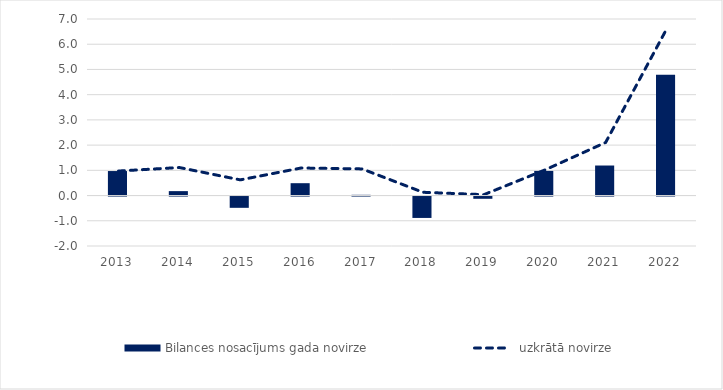
| Category | Bilances nosacījums |
|---|---|
| 2013.0 | 0.972 |
| 2014.0 | 0.176 |
| 2015.0 | -0.447 |
| 2016.0 | 0.49 |
| 2017.0 | 0.029 |
| 2018.0 | -0.848 |
| 2019.0 | -0.089 |
| 2020.0 | 0.977 |
| 2021.0 | 1.191 |
| 2022.0 | 4.791 |